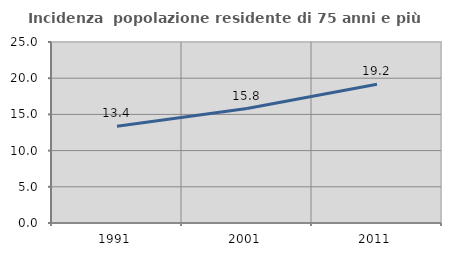
| Category | Incidenza  popolazione residente di 75 anni e più |
|---|---|
| 1991.0 | 13.365 |
| 2001.0 | 15.813 |
| 2011.0 | 19.16 |